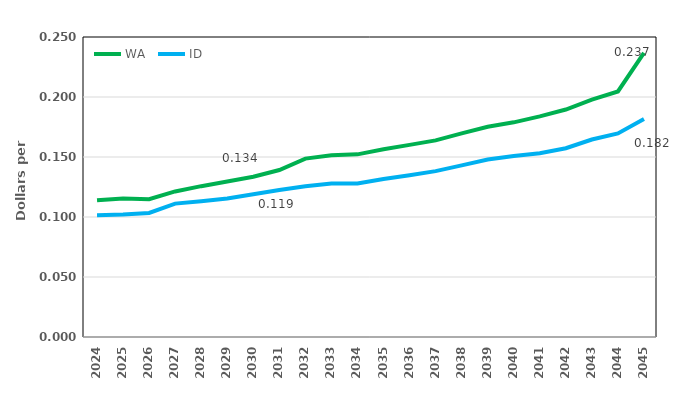
| Category | WA | ID |
|---|---|---|
| 2024.0 | 0.114 | 0.102 |
| 2025.0 | 0.116 | 0.102 |
| 2026.0 | 0.115 | 0.103 |
| 2027.0 | 0.121 | 0.111 |
| 2028.0 | 0.126 | 0.113 |
| 2029.0 | 0.13 | 0.115 |
| 2030.0 | 0.134 | 0.119 |
| 2031.0 | 0.139 | 0.122 |
| 2032.0 | 0.149 | 0.126 |
| 2033.0 | 0.151 | 0.128 |
| 2034.0 | 0.152 | 0.128 |
| 2035.0 | 0.156 | 0.132 |
| 2036.0 | 0.16 | 0.135 |
| 2037.0 | 0.164 | 0.138 |
| 2038.0 | 0.17 | 0.143 |
| 2039.0 | 0.175 | 0.148 |
| 2040.0 | 0.179 | 0.151 |
| 2041.0 | 0.184 | 0.153 |
| 2042.0 | 0.19 | 0.157 |
| 2043.0 | 0.198 | 0.165 |
| 2044.0 | 0.205 | 0.17 |
| 2045.0 | 0.237 | 0.182 |